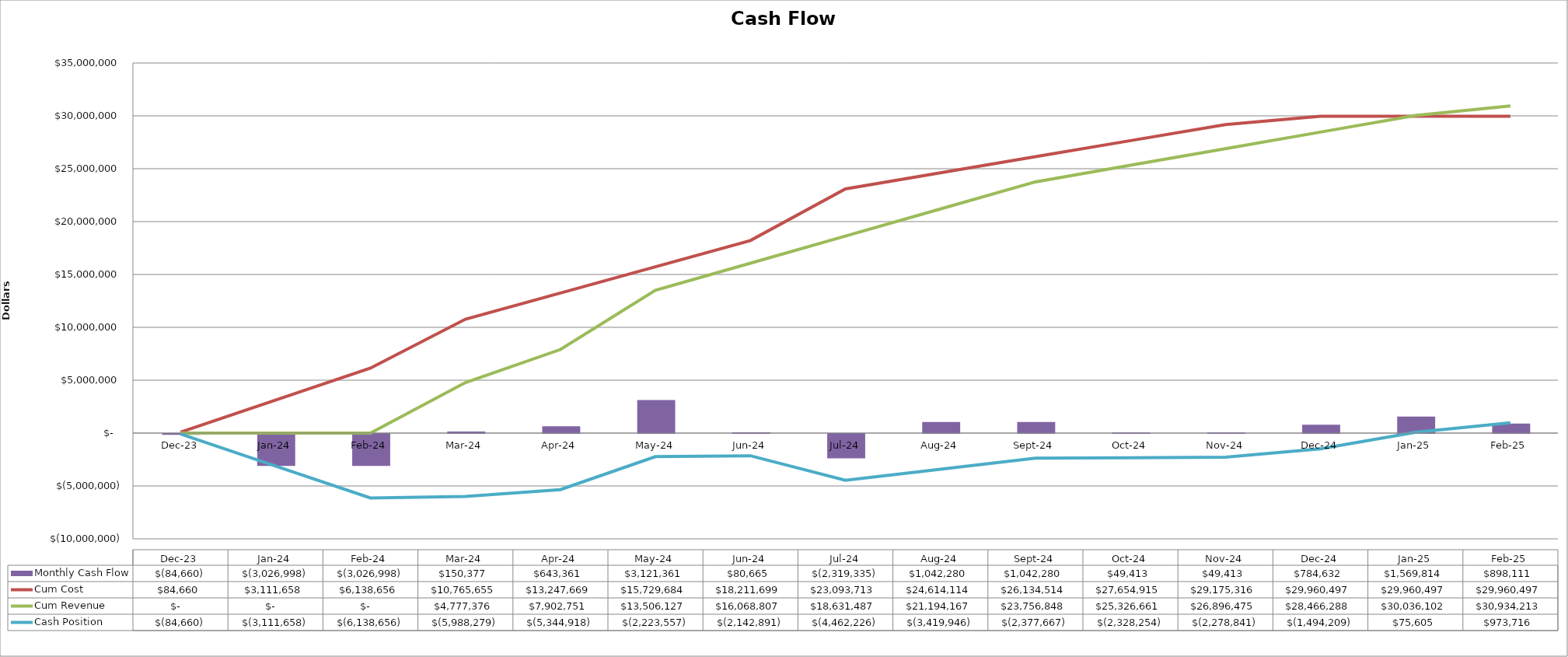
| Category | Monthly Cash Flow |
|---|---|
| 2023-12-15 | -84659.917 |
| 2024-01-15 | -3026998.254 |
| 2024-02-15 | -3026998.254 |
| 2024-03-17 | 150377.443 |
| 2024-04-17 | 643361.059 |
| 2024-05-18 | 3121361.059 |
| 2024-06-18 | 80665.476 |
| 2024-07-19 | -2319334.524 |
| 2024-08-19 | 1042279.519 |
| 2024-09-19 | 1042279.519 |
| 2024-10-20 | 49413.019 |
| 2024-11-20 | 49413.019 |
| 2024-12-21 | 784632.224 |
| 2025-01-21 | 1569813.614 |
| 2025-02-21 | 898111.149 |